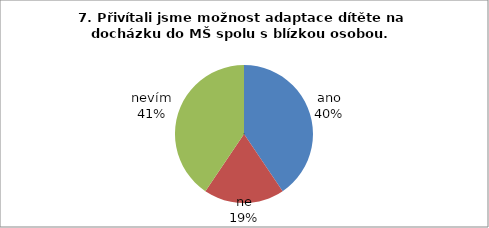
| Category | 7. Přivítali jsme možnost adaptace dítěte na docházku do MŠ spolu s blízkou osobou.  |
|---|---|
| ano | 15 |
| ne | 7 |
| nevím | 15 |